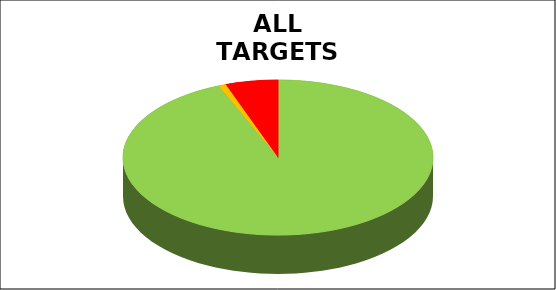
| Category | Series 0 |
|---|---|
| Green | 0.938 |
| Amber | 0.008 |
| Red | 0.055 |